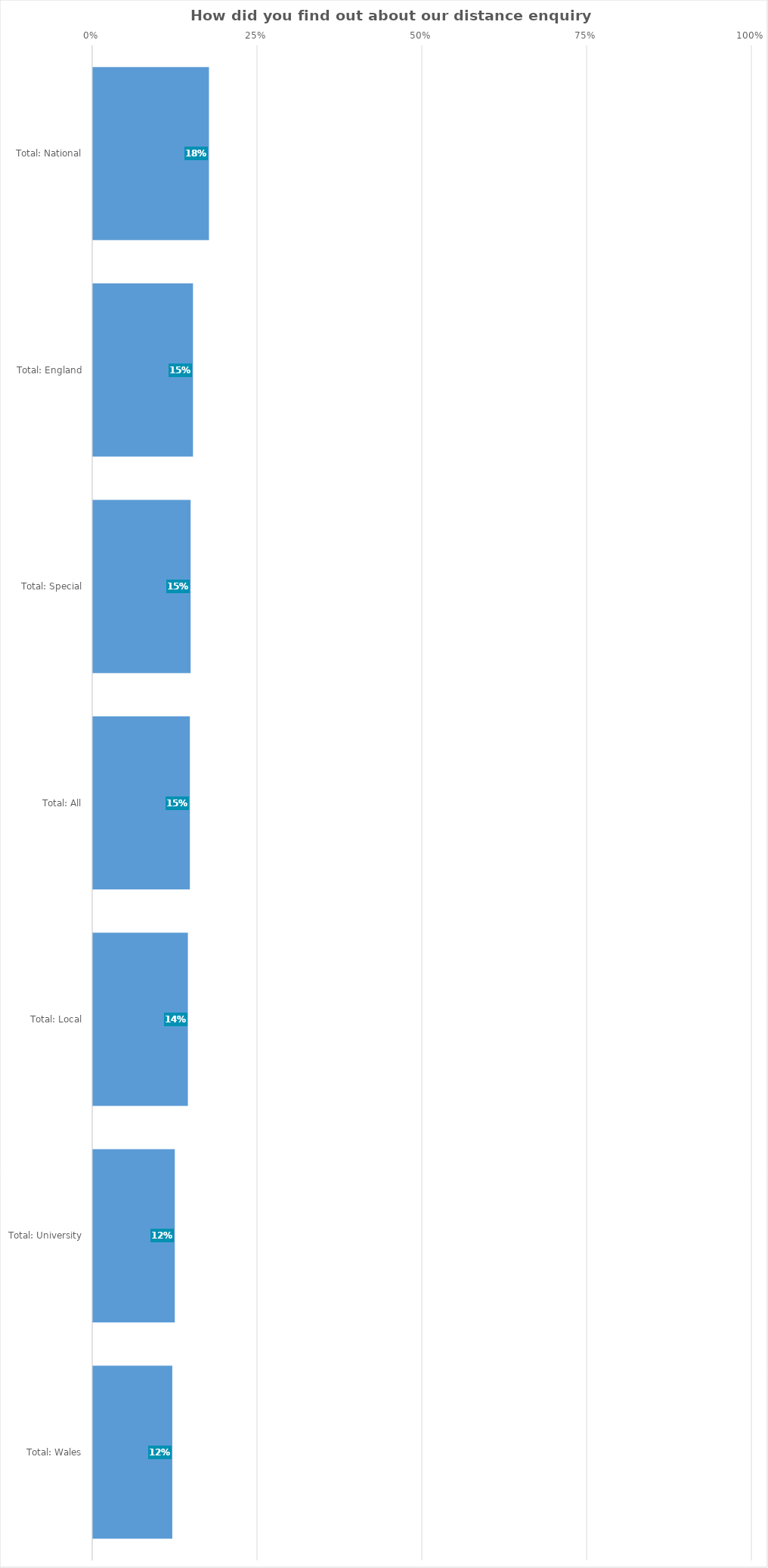
| Category | Other |
|---|---|
| Total: National | 0.176 |
| Total: England | 0.152 |
| Total: Special | 0.148 |
| Total: All | 0.147 |
| Total: Local | 0.144 |
| Total: University | 0.124 |
| Total: Wales | 0.12 |